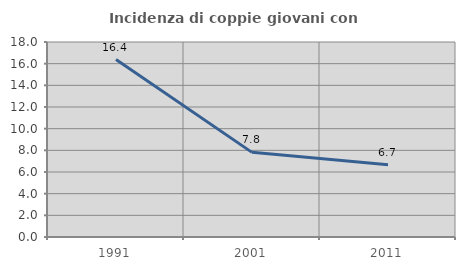
| Category | Incidenza di coppie giovani con figli |
|---|---|
| 1991.0 | 16.374 |
| 2001.0 | 7.812 |
| 2011.0 | 6.667 |